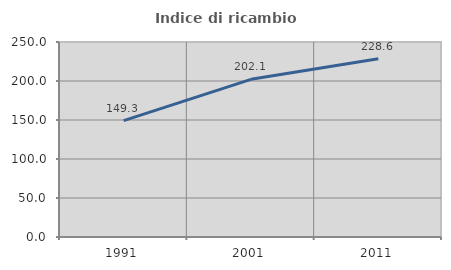
| Category | Indice di ricambio occupazionale  |
|---|---|
| 1991.0 | 149.285 |
| 2001.0 | 202.129 |
| 2011.0 | 228.594 |